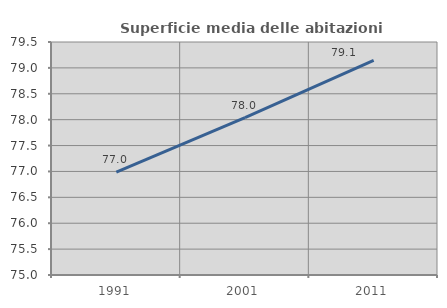
| Category | Superficie media delle abitazioni occupate |
|---|---|
| 1991.0 | 76.988 |
| 2001.0 | 78.038 |
| 2011.0 | 79.143 |